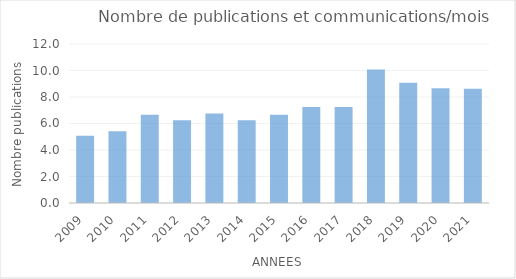
| Category | Series 0 |
|---|---|
| 2009.0 | 5.083 |
| 2010.0 | 5.417 |
| 2011.0 | 6.667 |
| 2012.0 | 6.25 |
| 2013.0 | 6.75 |
| 2014.0 | 6.25 |
| 2015.0 | 6.667 |
| 2016.0 | 7.25 |
| 2017.0 | 7.25 |
| 2018.0 | 10.083 |
| 2019.0 | 9.083 |
| 2020.0 | 8.667 |
| 2021.0 | 8.625 |